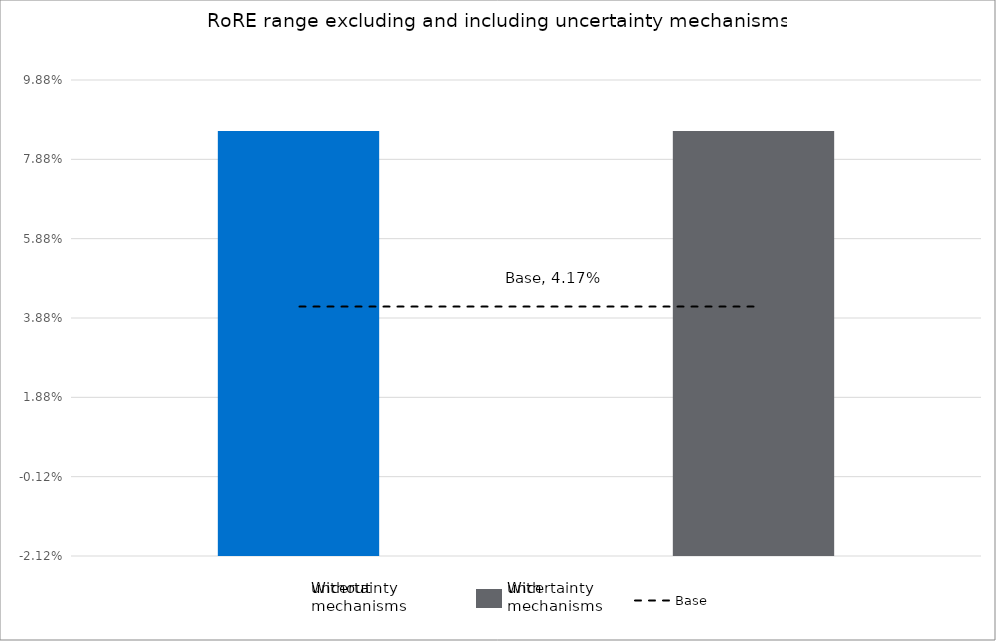
| Category | Low case | High case |
|---|---|---|
| Without uncertainty | -0.021 | 0.086 |
| Without uncertainty | -0.021 | 0.086 |